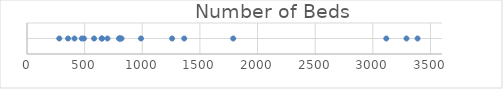
| Category | Series 0 |
|---|---|
| 280.0 | 1 |
| 356.0 | 1 |
| 412.0 | 1 |
| 475.0 | 1 |
| 494.0 | 1 |
| 582.0 | 1 |
| 648.0 | 1 |
| 650.0 | 1 |
| 698.0 | 1 |
| 800.0 | 1 |
| 801.0 | 1 |
| 810.0 | 1 |
| 820.0 | 1 |
| 989.0 | 1 |
| 1259.0 | 1 |
| 1364.0 | 1 |
| 1789.0 | 1 |
| 3117.0 | 1 |
| 3292.0 | 1 |
| 3388.0 | 1 |